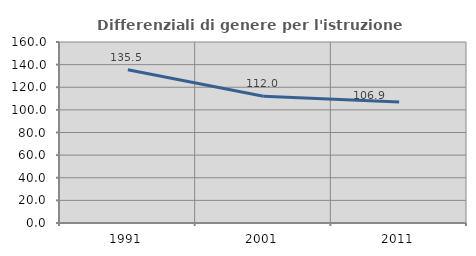
| Category | Differenziali di genere per l'istruzione superiore |
|---|---|
| 1991.0 | 135.519 |
| 2001.0 | 112.023 |
| 2011.0 | 106.9 |